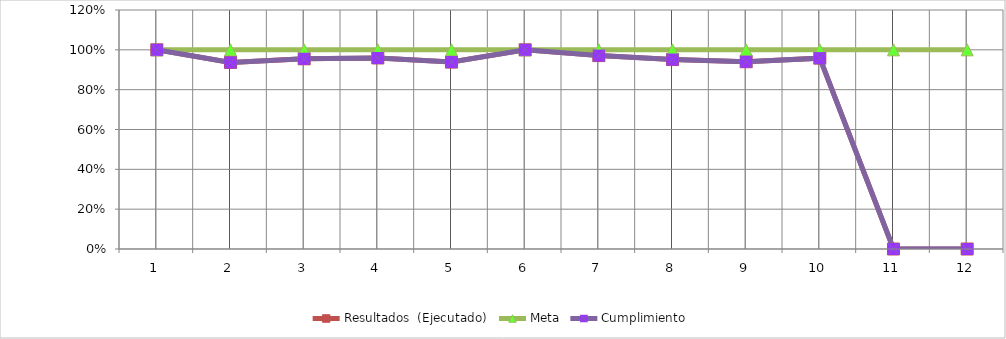
| Category | Resultados  (Ejecutado) | Meta | Cumplimiento |
|---|---|---|---|
| 0 | 1 | 1 | 1 |
| 1 | 0.937 | 1 | 0.937 |
| 2 | 0.955 | 1 | 0.955 |
| 3 | 0.959 | 1 | 0.959 |
| 4 | 0.938 | 1 | 0.938 |
| 5 | 1 | 1 | 1 |
| 6 | 0.971 | 1 | 0.971 |
| 7 | 0.951 | 1 | 0.951 |
| 8 | 0.94 | 1 | 0.94 |
| 9 | 0.958 | 1 | 0.958 |
| 10 | 0 | 1 | 0 |
| 11 | 0 | 1 | 0 |